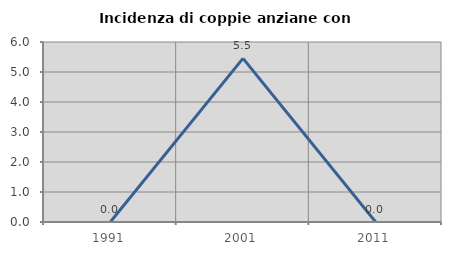
| Category | Incidenza di coppie anziane con figli |
|---|---|
| 1991.0 | 0 |
| 2001.0 | 5.455 |
| 2011.0 | 0 |